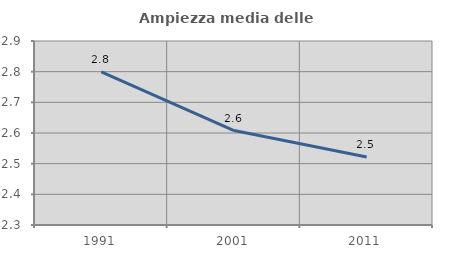
| Category | Ampiezza media delle famiglie |
|---|---|
| 1991.0 | 2.8 |
| 2001.0 | 2.608 |
| 2011.0 | 2.521 |